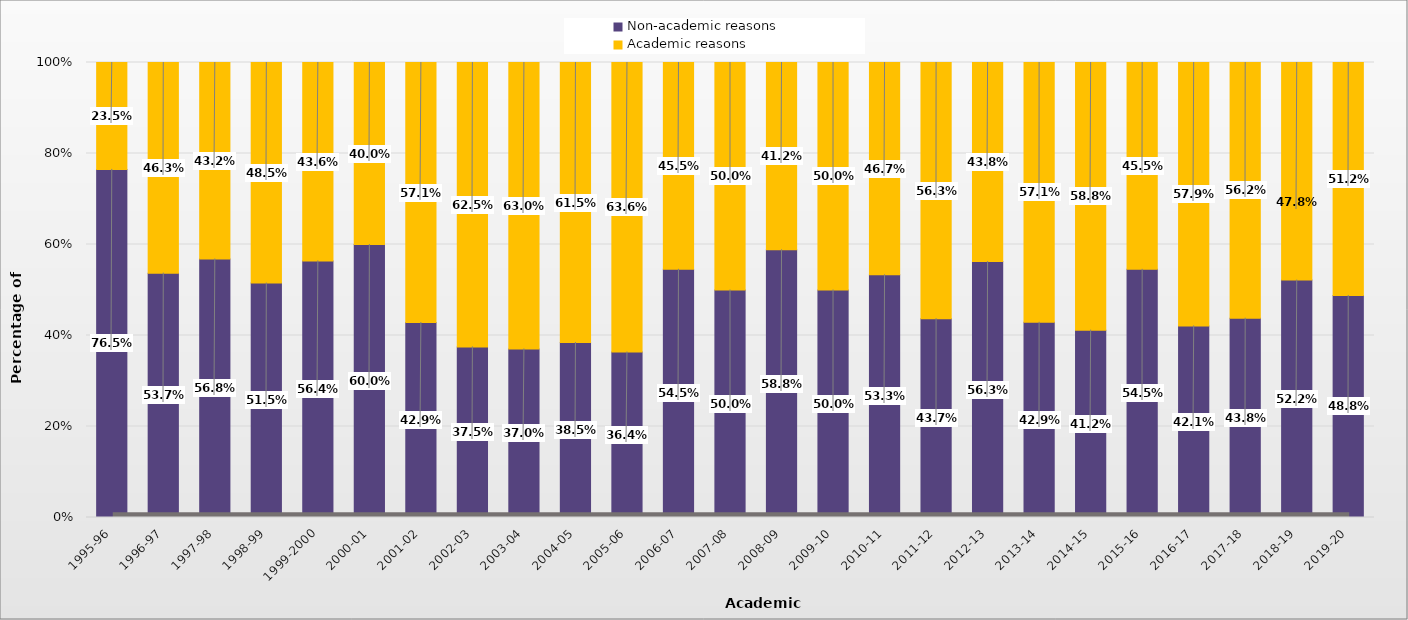
| Category | Non-academic reasons | Academic reasons |
|---|---|---|
| 1995-96 | 0.765 | 0.235 |
| 1996-97 | 0.537 | 0.463 |
| 1997-98 | 0.568 | 0.432 |
| 1998-99 | 0.515 | 0.485 |
| 1999-2000 | 0.564 | 0.436 |
| 2000-01 | 0.6 | 0.4 |
| 2001-02 | 0.429 | 0.571 |
| 2002-03 | 0.375 | 0.625 |
| 2003-04 | 0.37 | 0.63 |
| 2004-05 | 0.385 | 0.615 |
| 2005-06 | 0.364 | 0.636 |
| 2006-07 | 0.545 | 0.455 |
| 2007-08 | 0.5 | 0.5 |
| 2008-09 | 0.588 | 0.412 |
| 2009-10 | 0.5 | 0.5 |
| 2010-11 | 0.533 | 0.467 |
| 2011-12 | 0.437 | 0.563 |
| 2012-13 | 0.562 | 0.437 |
| 2013-14 | 0.429 | 0.571 |
| 2014-15 | 0.412 | 0.588 |
| 2015-16 | 0.545 | 0.455 |
| 2016-17 | 0.421 | 0.579 |
| 2017-18 | 0.438 | 0.562 |
| 2018-19 | 0.522 | 0.478 |
| 2019-20 | 0.488 | 0.512 |